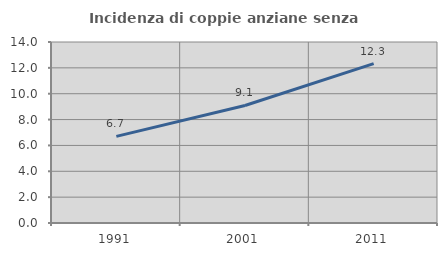
| Category | Incidenza di coppie anziane senza figli  |
|---|---|
| 1991.0 | 6.7 |
| 2001.0 | 9.091 |
| 2011.0 | 12.326 |